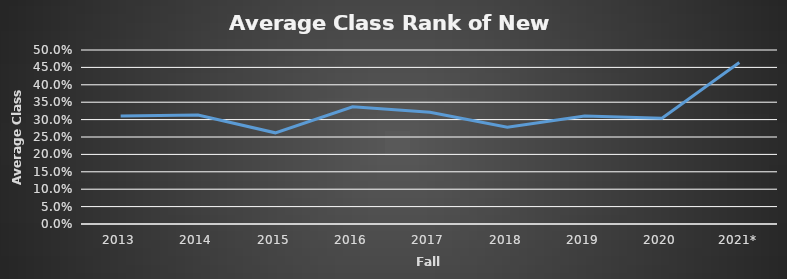
| Category | Series 0 |
|---|---|
| 2013 | 0.31 |
| 2014 | 0.313 |
| 2015 | 0.262 |
| 2016 | 0.337 |
| 2017 | 0.321 |
| 2018 | 0.278 |
| 2019 | 0.31 |
| 2020 | 0.304 |
| 2021* | 0.464 |